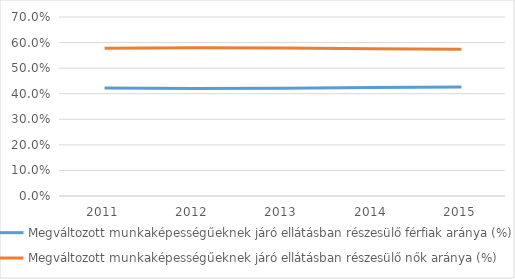
| Category | Megváltozott munkaképességűeknek járó ellátásban részesülő férfiak aránya (%) | Megváltozott munkaképességűeknek járó ellátásban részesülő nők aránya (%) |
|---|---|---|
| 2011.0 | 0.422 | 0.578 |
| 2012.0 | 0.42 | 0.58 |
| 2013.0 | 0.422 | 0.578 |
| 2014.0 | 0.424 | 0.576 |
| 2015.0 | 0.426 | 0.574 |